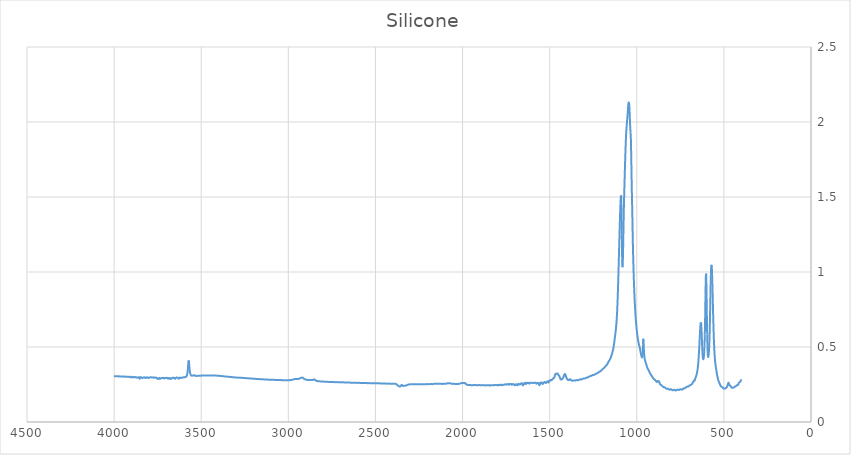
| Category | Silicone |
|---|---|
| 399.264 | 0.284 |
| 401.193 | 0.279 |
| 403.122 | 0.275 |
| 405.05 | 0.272 |
| 406.979 | 0.268 |
| 408.908 | 0.266 |
| 410.837 | 0.265 |
| 412.766 | 0.262 |
| 414.694 | 0.26 |
| 416.623 | 0.254 |
| 418.552 | 0.247 |
| 420.481 | 0.247 |
| 422.41 | 0.248 |
| 424.339 | 0.245 |
| 426.267 | 0.244 |
| 428.196 | 0.243 |
| 430.125 | 0.241 |
| 432.054 | 0.238 |
| 433.983 | 0.236 |
| 435.911 | 0.236 |
| 437.84 | 0.235 |
| 439.769 | 0.234 |
| 441.698 | 0.232 |
| 443.627 | 0.229 |
| 445.555 | 0.229 |
| 447.484 | 0.228 |
| 449.413 | 0.228 |
| 451.342 | 0.228 |
| 453.271 | 0.228 |
| 455.2 | 0.229 |
| 457.128 | 0.231 |
| 459.057 | 0.235 |
| 460.986 | 0.239 |
| 462.915 | 0.241 |
| 464.844 | 0.243 |
| 466.772 | 0.245 |
| 468.701 | 0.249 |
| 470.63 | 0.255 |
| 472.559 | 0.261 |
| 474.488 | 0.261 |
| 476.416 | 0.255 |
| 478.345 | 0.248 |
| 480.274 | 0.24 |
| 482.203 | 0.234 |
| 484.132 | 0.231 |
| 486.06 | 0.229 |
| 487.989 | 0.227 |
| 489.918 | 0.226 |
| 491.847 | 0.224 |
| 493.776 | 0.223 |
| 495.705 | 0.224 |
| 497.633 | 0.223 |
| 499.562 | 0.222 |
| 501.491 | 0.223 |
| 503.42 | 0.225 |
| 505.349 | 0.228 |
| 507.277 | 0.23 |
| 509.206 | 0.232 |
| 511.135 | 0.234 |
| 513.064 | 0.235 |
| 514.993 | 0.236 |
| 516.921 | 0.238 |
| 518.85 | 0.241 |
| 520.779 | 0.246 |
| 522.708 | 0.252 |
| 524.637 | 0.257 |
| 526.566 | 0.261 |
| 528.494 | 0.267 |
| 530.423 | 0.273 |
| 532.352 | 0.28 |
| 534.281 | 0.288 |
| 536.21 | 0.298 |
| 538.138 | 0.309 |
| 540.067 | 0.322 |
| 541.996 | 0.336 |
| 543.925 | 0.35 |
| 545.854 | 0.363 |
| 547.782 | 0.378 |
| 549.711 | 0.397 |
| 551.64 | 0.423 |
| 553.569 | 0.455 |
| 555.498 | 0.495 |
| 557.427 | 0.548 |
| 559.355 | 0.616 |
| 561.284 | 0.696 |
| 563.213 | 0.786 |
| 565.142 | 0.879 |
| 567.071 | 0.963 |
| 568.999 | 1.023 |
| 570.928 | 1.048 |
| 572.857 | 1.035 |
| 574.786 | 0.979 |
| 576.715 | 0.881 |
| 578.643 | 0.761 |
| 580.572 | 0.649 |
| 582.501 | 0.56 |
| 584.43 | 0.5 |
| 586.359 | 0.464 |
| 588.287 | 0.442 |
| 590.216 | 0.433 |
| 592.145 | 0.447 |
| 594.074 | 0.494 |
| 596.003 | 0.584 |
| 597.932 | 0.727 |
| 599.86 | 0.887 |
| 601.789 | 0.989 |
| 603.718 | 0.972 |
| 605.647 | 0.85 |
| 607.576 | 0.7 |
| 609.504 | 0.582 |
| 611.433 | 0.506 |
| 613.362 | 0.46 |
| 615.291 | 0.434 |
| 617.22 | 0.421 |
| 619.148 | 0.419 |
| 621.077 | 0.433 |
| 623.006 | 0.463 |
| 624.935 | 0.51 |
| 626.864 | 0.568 |
| 628.793 | 0.624 |
| 630.721 | 0.658 |
| 632.65 | 0.665 |
| 634.579 | 0.647 |
| 636.508 | 0.611 |
| 638.437 | 0.567 |
| 640.365 | 0.521 |
| 642.294 | 0.478 |
| 644.223 | 0.44 |
| 646.152 | 0.407 |
| 648.081 | 0.381 |
| 650.009 | 0.36 |
| 651.938 | 0.344 |
| 653.867 | 0.331 |
| 655.796 | 0.32 |
| 657.725 | 0.312 |
| 659.654 | 0.305 |
| 661.582 | 0.298 |
| 663.511 | 0.293 |
| 665.44 | 0.286 |
| 667.369 | 0.277 |
| 669.298 | 0.274 |
| 671.226 | 0.276 |
| 673.155 | 0.274 |
| 675.084 | 0.27 |
| 677.013 | 0.266 |
| 678.942 | 0.262 |
| 680.87 | 0.258 |
| 682.799 | 0.254 |
| 684.728 | 0.251 |
| 686.657 | 0.249 |
| 688.586 | 0.248 |
| 690.515 | 0.247 |
| 692.443 | 0.246 |
| 694.372 | 0.245 |
| 696.301 | 0.244 |
| 698.23 | 0.242 |
| 700.159 | 0.24 |
| 702.087 | 0.238 |
| 704.016 | 0.237 |
| 705.945 | 0.236 |
| 707.874 | 0.236 |
| 709.803 | 0.236 |
| 711.731 | 0.236 |
| 713.66 | 0.235 |
| 715.589 | 0.234 |
| 717.518 | 0.231 |
| 719.447 | 0.229 |
| 721.375 | 0.227 |
| 723.304 | 0.225 |
| 725.233 | 0.224 |
| 727.162 | 0.224 |
| 729.091 | 0.224 |
| 731.02 | 0.224 |
| 732.948 | 0.223 |
| 734.877 | 0.221 |
| 736.806 | 0.218 |
| 738.735 | 0.216 |
| 740.664 | 0.216 |
| 742.592 | 0.216 |
| 744.521 | 0.217 |
| 746.45 | 0.218 |
| 748.379 | 0.218 |
| 750.308 | 0.218 |
| 752.236 | 0.217 |
| 754.165 | 0.215 |
| 756.094 | 0.214 |
| 758.023 | 0.213 |
| 759.952 | 0.213 |
| 761.881 | 0.214 |
| 763.809 | 0.215 |
| 765.738 | 0.216 |
| 767.667 | 0.216 |
| 769.596 | 0.215 |
| 771.525 | 0.213 |
| 773.453 | 0.211 |
| 775.382 | 0.21 |
| 777.311 | 0.21 |
| 779.24 | 0.211 |
| 781.169 | 0.213 |
| 783.097 | 0.214 |
| 785.026 | 0.215 |
| 786.955 | 0.215 |
| 788.884 | 0.214 |
| 790.813 | 0.212 |
| 792.742 | 0.212 |
| 794.67 | 0.212 |
| 796.599 | 0.213 |
| 798.528 | 0.215 |
| 800.457 | 0.217 |
| 802.386 | 0.218 |
| 804.314 | 0.218 |
| 806.243 | 0.218 |
| 808.172 | 0.216 |
| 810.101 | 0.215 |
| 812.03 | 0.215 |
| 813.958 | 0.216 |
| 815.887 | 0.217 |
| 817.816 | 0.219 |
| 819.745 | 0.221 |
| 821.674 | 0.222 |
| 823.602 | 0.222 |
| 825.531 | 0.222 |
| 827.46 | 0.221 |
| 829.389 | 0.222 |
| 831.318 | 0.222 |
| 833.247 | 0.224 |
| 835.175 | 0.226 |
| 837.104 | 0.229 |
| 839.033 | 0.23 |
| 840.962 | 0.231 |
| 842.891 | 0.232 |
| 844.819 | 0.232 |
| 846.748 | 0.233 |
| 848.677 | 0.234 |
| 850.606 | 0.236 |
| 852.535 | 0.238 |
| 854.463 | 0.241 |
| 856.392 | 0.243 |
| 858.321 | 0.245 |
| 860.25 | 0.246 |
| 862.179 | 0.248 |
| 864.108 | 0.25 |
| 866.036 | 0.252 |
| 867.965 | 0.256 |
| 869.894 | 0.262 |
| 871.823 | 0.269 |
| 873.752 | 0.272 |
| 875.68 | 0.271 |
| 877.609 | 0.271 |
| 879.538 | 0.274 |
| 881.467 | 0.272 |
| 883.396 | 0.268 |
| 885.324 | 0.267 |
| 887.253 | 0.269 |
| 889.182 | 0.272 |
| 891.111 | 0.275 |
| 893.04 | 0.278 |
| 894.969 | 0.28 |
| 896.897 | 0.282 |
| 898.826 | 0.284 |
| 900.755 | 0.285 |
| 902.684 | 0.287 |
| 904.613 | 0.29 |
| 906.541 | 0.293 |
| 908.47 | 0.297 |
| 910.399 | 0.301 |
| 912.328 | 0.304 |
| 914.257 | 0.308 |
| 916.185 | 0.311 |
| 918.114 | 0.314 |
| 920.043 | 0.317 |
| 921.972 | 0.321 |
| 923.901 | 0.325 |
| 925.83 | 0.33 |
| 927.758 | 0.334 |
| 929.687 | 0.339 |
| 931.616 | 0.344 |
| 933.545 | 0.348 |
| 935.474 | 0.352 |
| 937.402 | 0.356 |
| 939.331 | 0.361 |
| 941.26 | 0.368 |
| 943.189 | 0.375 |
| 945.118 | 0.383 |
| 947.046 | 0.39 |
| 948.975 | 0.396 |
| 950.904 | 0.404 |
| 952.833 | 0.412 |
| 954.762 | 0.422 |
| 956.69 | 0.44 |
| 958.619 | 0.468 |
| 960.548 | 0.518 |
| 962.477 | 0.555 |
| 964.406 | 0.516 |
| 966.335 | 0.453 |
| 968.263 | 0.429 |
| 970.192 | 0.429 |
| 972.121 | 0.436 |
| 974.05 | 0.444 |
| 975.979 | 0.453 |
| 977.907 | 0.464 |
| 979.836 | 0.476 |
| 981.765 | 0.489 |
| 983.694 | 0.499 |
| 985.623 | 0.508 |
| 987.551 | 0.516 |
| 989.48 | 0.526 |
| 991.409 | 0.537 |
| 993.338 | 0.551 |
| 995.267 | 0.565 |
| 997.196 | 0.582 |
| 999.124 | 0.602 |
| 1001.05 | 0.623 |
| 1002.98 | 0.647 |
| 1004.91 | 0.674 |
| 1006.84 | 0.704 |
| 1008.77 | 0.739 |
| 1010.7 | 0.78 |
| 1012.63 | 0.825 |
| 1014.55 | 0.877 |
| 1016.48 | 0.938 |
| 1018.41 | 1.007 |
| 1020.34 | 1.084 |
| 1022.27 | 1.178 |
| 1024.2 | 1.296 |
| 1026.13 | 1.417 |
| 1028.06 | 1.525 |
| 1029.99 | 1.643 |
| 1031.91 | 1.78 |
| 1033.84 | 1.886 |
| 1035.77 | 1.932 |
| 1037.7 | 1.965 |
| 1039.63 | 2.021 |
| 1041.56 | 2.08 |
| 1043.49 | 2.115 |
| 1045.42 | 2.13 |
| 1047.34 | 2.126 |
| 1049.27 | 2.105 |
| 1051.2 | 2.075 |
| 1053.13 | 2.045 |
| 1055.06 | 2.018 |
| 1056.99 | 1.989 |
| 1058.92 | 1.959 |
| 1060.85 | 1.925 |
| 1062.78 | 1.877 |
| 1064.7 | 1.815 |
| 1066.63 | 1.746 |
| 1068.56 | 1.67 |
| 1070.49 | 1.591 |
| 1072.42 | 1.507 |
| 1074.35 | 1.412 |
| 1076.28 | 1.295 |
| 1078.21 | 1.169 |
| 1080.13 | 1.069 |
| 1082.06 | 1.032 |
| 1083.99 | 1.091 |
| 1085.92 | 1.248 |
| 1087.85 | 1.427 |
| 1089.78 | 1.511 |
| 1091.71 | 1.505 |
| 1093.64 | 1.459 |
| 1095.56 | 1.395 |
| 1097.49 | 1.32 |
| 1099.42 | 1.239 |
| 1101.35 | 1.155 |
| 1103.28 | 1.072 |
| 1105.21 | 0.99 |
| 1107.14 | 0.913 |
| 1109.07 | 0.843 |
| 1111.0 | 0.782 |
| 1112.92 | 0.732 |
| 1114.85 | 0.691 |
| 1116.78 | 0.658 |
| 1118.71 | 0.633 |
| 1120.64 | 0.612 |
| 1122.57 | 0.593 |
| 1124.5 | 0.575 |
| 1126.43 | 0.557 |
| 1128.35 | 0.539 |
| 1130.28 | 0.522 |
| 1132.21 | 0.507 |
| 1134.14 | 0.494 |
| 1136.07 | 0.483 |
| 1138.0 | 0.473 |
| 1139.93 | 0.465 |
| 1141.86 | 0.457 |
| 1143.79 | 0.449 |
| 1145.71 | 0.442 |
| 1147.64 | 0.435 |
| 1149.57 | 0.429 |
| 1151.5 | 0.423 |
| 1153.43 | 0.419 |
| 1155.36 | 0.415 |
| 1157.29 | 0.411 |
| 1159.22 | 0.407 |
| 1161.14 | 0.404 |
| 1163.07 | 0.4 |
| 1165.0 | 0.395 |
| 1166.93 | 0.391 |
| 1168.86 | 0.387 |
| 1170.79 | 0.383 |
| 1172.72 | 0.38 |
| 1174.65 | 0.378 |
| 1176.57 | 0.376 |
| 1178.5 | 0.373 |
| 1180.43 | 0.371 |
| 1182.36 | 0.368 |
| 1184.29 | 0.365 |
| 1186.22 | 0.362 |
| 1188.15 | 0.36 |
| 1190.08 | 0.357 |
| 1192.01 | 0.356 |
| 1193.93 | 0.355 |
| 1195.86 | 0.353 |
| 1197.79 | 0.351 |
| 1199.72 | 0.349 |
| 1201.65 | 0.346 |
| 1203.58 | 0.343 |
| 1205.51 | 0.341 |
| 1207.44 | 0.339 |
| 1209.36 | 0.338 |
| 1211.29 | 0.337 |
| 1213.22 | 0.336 |
| 1215.15 | 0.335 |
| 1217.08 | 0.333 |
| 1219.01 | 0.331 |
| 1220.94 | 0.329 |
| 1222.87 | 0.327 |
| 1224.8 | 0.326 |
| 1226.72 | 0.325 |
| 1228.65 | 0.324 |
| 1230.58 | 0.324 |
| 1232.51 | 0.323 |
| 1234.44 | 0.322 |
| 1236.37 | 0.321 |
| 1238.3 | 0.319 |
| 1240.23 | 0.317 |
| 1242.15 | 0.316 |
| 1244.08 | 0.315 |
| 1246.01 | 0.314 |
| 1247.94 | 0.314 |
| 1249.87 | 0.314 |
| 1251.8 | 0.314 |
| 1253.73 | 0.313 |
| 1255.66 | 0.311 |
| 1257.59 | 0.31 |
| 1259.51 | 0.309 |
| 1261.44 | 0.308 |
| 1263.37 | 0.307 |
| 1265.3 | 0.306 |
| 1267.23 | 0.306 |
| 1269.16 | 0.305 |
| 1271.09 | 0.305 |
| 1273.02 | 0.303 |
| 1274.94 | 0.302 |
| 1276.87 | 0.3 |
| 1278.8 | 0.299 |
| 1280.73 | 0.298 |
| 1282.66 | 0.297 |
| 1284.59 | 0.297 |
| 1286.52 | 0.297 |
| 1288.45 | 0.296 |
| 1290.37 | 0.295 |
| 1292.3 | 0.294 |
| 1294.23 | 0.292 |
| 1296.16 | 0.291 |
| 1298.09 | 0.29 |
| 1300.02 | 0.29 |
| 1301.95 | 0.29 |
| 1303.88 | 0.29 |
| 1305.81 | 0.29 |
| 1307.73 | 0.289 |
| 1309.66 | 0.288 |
| 1311.59 | 0.287 |
| 1313.52 | 0.285 |
| 1315.45 | 0.285 |
| 1317.38 | 0.284 |
| 1319.31 | 0.284 |
| 1321.24 | 0.284 |
| 1323.16 | 0.285 |
| 1325.09 | 0.285 |
| 1327.02 | 0.284 |
| 1328.95 | 0.283 |
| 1330.88 | 0.281 |
| 1332.81 | 0.28 |
| 1334.74 | 0.279 |
| 1336.67 | 0.279 |
| 1338.6 | 0.278 |
| 1340.52 | 0.279 |
| 1342.45 | 0.28 |
| 1344.38 | 0.28 |
| 1346.31 | 0.279 |
| 1348.24 | 0.278 |
| 1350.17 | 0.277 |
| 1352.1 | 0.277 |
| 1354.03 | 0.276 |
| 1355.95 | 0.276 |
| 1357.88 | 0.277 |
| 1359.81 | 0.277 |
| 1361.74 | 0.276 |
| 1363.67 | 0.276 |
| 1365.6 | 0.277 |
| 1367.53 | 0.276 |
| 1369.46 | 0.276 |
| 1371.38 | 0.276 |
| 1373.31 | 0.276 |
| 1375.24 | 0.277 |
| 1377.17 | 0.279 |
| 1379.1 | 0.281 |
| 1381.03 | 0.283 |
| 1382.96 | 0.286 |
| 1384.89 | 0.285 |
| 1386.82 | 0.281 |
| 1388.74 | 0.279 |
| 1390.67 | 0.28 |
| 1392.6 | 0.279 |
| 1394.53 | 0.279 |
| 1396.46 | 0.282 |
| 1398.39 | 0.284 |
| 1400.32 | 0.288 |
| 1402.25 | 0.292 |
| 1404.17 | 0.296 |
| 1406.1 | 0.302 |
| 1408.03 | 0.31 |
| 1409.96 | 0.316 |
| 1411.89 | 0.319 |
| 1413.82 | 0.319 |
| 1415.75 | 0.316 |
| 1417.68 | 0.31 |
| 1419.61 | 0.303 |
| 1421.53 | 0.3 |
| 1423.46 | 0.296 |
| 1425.39 | 0.291 |
| 1427.32 | 0.288 |
| 1429.25 | 0.285 |
| 1431.18 | 0.285 |
| 1433.11 | 0.285 |
| 1435.04 | 0.284 |
| 1436.96 | 0.283 |
| 1438.89 | 0.288 |
| 1440.82 | 0.294 |
| 1442.75 | 0.3 |
| 1444.68 | 0.306 |
| 1446.61 | 0.31 |
| 1448.54 | 0.311 |
| 1450.47 | 0.314 |
| 1452.4 | 0.319 |
| 1454.32 | 0.324 |
| 1456.25 | 0.323 |
| 1458.18 | 0.322 |
| 1460.11 | 0.322 |
| 1462.04 | 0.322 |
| 1463.97 | 0.321 |
| 1465.9 | 0.321 |
| 1467.83 | 0.318 |
| 1469.75 | 0.311 |
| 1471.68 | 0.302 |
| 1473.61 | 0.297 |
| 1475.54 | 0.295 |
| 1477.47 | 0.293 |
| 1479.4 | 0.291 |
| 1481.33 | 0.288 |
| 1483.26 | 0.286 |
| 1485.18 | 0.284 |
| 1487.11 | 0.281 |
| 1489.04 | 0.279 |
| 1490.97 | 0.279 |
| 1492.9 | 0.281 |
| 1494.83 | 0.279 |
| 1496.76 | 0.275 |
| 1498.69 | 0.275 |
| 1500.62 | 0.276 |
| 1502.54 | 0.276 |
| 1504.47 | 0.27 |
| 1506.4 | 0.264 |
| 1508.33 | 0.266 |
| 1510.26 | 0.27 |
| 1512.19 | 0.271 |
| 1514.12 | 0.27 |
| 1516.05 | 0.267 |
| 1517.97 | 0.265 |
| 1519.9 | 0.262 |
| 1521.83 | 0.26 |
| 1523.76 | 0.263 |
| 1525.69 | 0.264 |
| 1527.62 | 0.265 |
| 1529.55 | 0.267 |
| 1531.48 | 0.265 |
| 1533.41 | 0.262 |
| 1535.33 | 0.263 |
| 1537.26 | 0.261 |
| 1539.19 | 0.254 |
| 1541.12 | 0.253 |
| 1543.05 | 0.258 |
| 1544.98 | 0.261 |
| 1546.91 | 0.264 |
| 1548.84 | 0.264 |
| 1550.76 | 0.262 |
| 1552.69 | 0.26 |
| 1554.62 | 0.257 |
| 1556.55 | 0.252 |
| 1558.48 | 0.245 |
| 1560.41 | 0.249 |
| 1562.34 | 0.258 |
| 1564.27 | 0.26 |
| 1566.19 | 0.261 |
| 1568.12 | 0.259 |
| 1570.05 | 0.258 |
| 1571.98 | 0.26 |
| 1573.91 | 0.259 |
| 1575.84 | 0.255 |
| 1577.77 | 0.257 |
| 1579.7 | 0.261 |
| 1581.63 | 0.262 |
| 1583.55 | 0.262 |
| 1585.48 | 0.262 |
| 1587.41 | 0.262 |
| 1589.34 | 0.261 |
| 1591.27 | 0.26 |
| 1593.2 | 0.259 |
| 1595.13 | 0.259 |
| 1597.06 | 0.26 |
| 1598.98 | 0.261 |
| 1600.91 | 0.261 |
| 1602.84 | 0.262 |
| 1604.77 | 0.262 |
| 1606.7 | 0.262 |
| 1608.63 | 0.261 |
| 1610.56 | 0.26 |
| 1612.49 | 0.26 |
| 1614.42 | 0.258 |
| 1616.34 | 0.255 |
| 1618.27 | 0.258 |
| 1620.2 | 0.261 |
| 1622.13 | 0.26 |
| 1624.06 | 0.26 |
| 1625.99 | 0.261 |
| 1627.92 | 0.261 |
| 1629.85 | 0.261 |
| 1631.77 | 0.261 |
| 1633.7 | 0.257 |
| 1635.63 | 0.253 |
| 1637.56 | 0.256 |
| 1639.49 | 0.26 |
| 1641.42 | 0.261 |
| 1643.35 | 0.26 |
| 1645.28 | 0.255 |
| 1647.2 | 0.253 |
| 1649.13 | 0.255 |
| 1651.06 | 0.251 |
| 1652.99 | 0.244 |
| 1654.92 | 0.25 |
| 1656.85 | 0.257 |
| 1658.78 | 0.258 |
| 1660.71 | 0.257 |
| 1662.64 | 0.255 |
| 1664.56 | 0.256 |
| 1666.49 | 0.255 |
| 1668.42 | 0.251 |
| 1670.35 | 0.25 |
| 1672.28 | 0.252 |
| 1674.21 | 0.251 |
| 1676.14 | 0.251 |
| 1678.07 | 0.254 |
| 1679.99 | 0.254 |
| 1681.92 | 0.25 |
| 1683.85 | 0.245 |
| 1685.78 | 0.246 |
| 1687.71 | 0.251 |
| 1689.64 | 0.251 |
| 1691.57 | 0.252 |
| 1693.5 | 0.251 |
| 1695.43 | 0.247 |
| 1697.35 | 0.247 |
| 1699.28 | 0.245 |
| 1701.21 | 0.245 |
| 1703.14 | 0.25 |
| 1705.07 | 0.25 |
| 1707.0 | 0.25 |
| 1708.93 | 0.252 |
| 1710.86 | 0.253 |
| 1712.78 | 0.253 |
| 1714.71 | 0.251 |
| 1716.64 | 0.248 |
| 1718.57 | 0.249 |
| 1720.5 | 0.253 |
| 1722.43 | 0.254 |
| 1724.36 | 0.253 |
| 1726.29 | 0.253 |
| 1728.22 | 0.253 |
| 1730.14 | 0.253 |
| 1732.07 | 0.25 |
| 1734.0 | 0.248 |
| 1735.93 | 0.251 |
| 1737.86 | 0.254 |
| 1739.79 | 0.252 |
| 1741.72 | 0.252 |
| 1743.65 | 0.252 |
| 1745.57 | 0.251 |
| 1747.5 | 0.251 |
| 1749.43 | 0.249 |
| 1751.36 | 0.249 |
| 1753.29 | 0.252 |
| 1755.22 | 0.252 |
| 1757.15 | 0.25 |
| 1759.08 | 0.25 |
| 1761.0 | 0.248 |
| 1762.93 | 0.247 |
| 1764.86 | 0.249 |
| 1766.79 | 0.248 |
| 1768.72 | 0.247 |
| 1770.65 | 0.246 |
| 1772.58 | 0.245 |
| 1774.51 | 0.247 |
| 1776.44 | 0.249 |
| 1778.36 | 0.248 |
| 1780.29 | 0.247 |
| 1782.22 | 0.247 |
| 1784.15 | 0.247 |
| 1786.08 | 0.247 |
| 1788.01 | 0.248 |
| 1789.94 | 0.247 |
| 1791.87 | 0.245 |
| 1793.79 | 0.245 |
| 1795.72 | 0.247 |
| 1797.65 | 0.246 |
| 1799.58 | 0.245 |
| 1801.51 | 0.245 |
| 1803.44 | 0.246 |
| 1805.37 | 0.247 |
| 1807.3 | 0.247 |
| 1809.23 | 0.247 |
| 1811.15 | 0.246 |
| 1813.08 | 0.247 |
| 1815.01 | 0.246 |
| 1816.94 | 0.246 |
| 1818.87 | 0.246 |
| 1820.8 | 0.246 |
| 1822.73 | 0.246 |
| 1824.66 | 0.245 |
| 1826.58 | 0.245 |
| 1828.51 | 0.245 |
| 1830.44 | 0.244 |
| 1832.37 | 0.245 |
| 1834.3 | 0.246 |
| 1836.23 | 0.245 |
| 1838.16 | 0.245 |
| 1840.09 | 0.245 |
| 1842.01 | 0.244 |
| 1843.94 | 0.242 |
| 1845.87 | 0.244 |
| 1847.8 | 0.245 |
| 1849.73 | 0.246 |
| 1851.66 | 0.245 |
| 1853.59 | 0.245 |
| 1855.52 | 0.245 |
| 1857.45 | 0.245 |
| 1859.37 | 0.245 |
| 1861.3 | 0.245 |
| 1863.23 | 0.245 |
| 1865.16 | 0.245 |
| 1867.09 | 0.244 |
| 1869.02 | 0.243 |
| 1870.95 | 0.244 |
| 1872.88 | 0.245 |
| 1874.8 | 0.245 |
| 1876.73 | 0.245 |
| 1878.66 | 0.245 |
| 1880.59 | 0.246 |
| 1882.52 | 0.246 |
| 1884.45 | 0.246 |
| 1886.38 | 0.246 |
| 1888.31 | 0.245 |
| 1890.24 | 0.245 |
| 1892.16 | 0.245 |
| 1894.09 | 0.245 |
| 1896.02 | 0.245 |
| 1897.95 | 0.246 |
| 1899.88 | 0.246 |
| 1901.81 | 0.246 |
| 1903.74 | 0.246 |
| 1905.67 | 0.246 |
| 1907.59 | 0.246 |
| 1909.52 | 0.245 |
| 1911.45 | 0.245 |
| 1913.38 | 0.246 |
| 1915.31 | 0.245 |
| 1917.24 | 0.245 |
| 1919.17 | 0.245 |
| 1921.1 | 0.246 |
| 1923.03 | 0.246 |
| 1924.95 | 0.246 |
| 1926.88 | 0.246 |
| 1928.81 | 0.246 |
| 1930.74 | 0.246 |
| 1932.67 | 0.246 |
| 1934.6 | 0.246 |
| 1936.53 | 0.246 |
| 1938.46 | 0.246 |
| 1940.38 | 0.246 |
| 1942.31 | 0.245 |
| 1944.24 | 0.245 |
| 1946.17 | 0.246 |
| 1948.1 | 0.246 |
| 1950.03 | 0.246 |
| 1951.96 | 0.246 |
| 1953.89 | 0.246 |
| 1955.81 | 0.246 |
| 1957.74 | 0.247 |
| 1959.67 | 0.247 |
| 1961.6 | 0.247 |
| 1963.53 | 0.247 |
| 1965.46 | 0.246 |
| 1967.39 | 0.246 |
| 1969.32 | 0.247 |
| 1971.25 | 0.247 |
| 1973.17 | 0.248 |
| 1975.1 | 0.249 |
| 1977.03 | 0.25 |
| 1978.96 | 0.251 |
| 1980.89 | 0.253 |
| 1982.82 | 0.256 |
| 1984.75 | 0.258 |
| 1986.68 | 0.26 |
| 1988.6 | 0.26 |
| 1990.53 | 0.26 |
| 1992.46 | 0.259 |
| 1994.39 | 0.259 |
| 1996.32 | 0.259 |
| 1998.25 | 0.26 |
| 2000.18 | 0.26 |
| 2002.11 | 0.261 |
| 2004.04 | 0.26 |
| 2005.96 | 0.26 |
| 2007.89 | 0.259 |
| 2009.82 | 0.258 |
| 2011.75 | 0.257 |
| 2013.68 | 0.257 |
| 2015.61 | 0.256 |
| 2017.54 | 0.255 |
| 2019.47 | 0.255 |
| 2021.39 | 0.255 |
| 2023.32 | 0.254 |
| 2025.25 | 0.254 |
| 2027.18 | 0.254 |
| 2029.11 | 0.254 |
| 2031.04 | 0.254 |
| 2032.97 | 0.254 |
| 2034.9 | 0.254 |
| 2036.82 | 0.253 |
| 2038.75 | 0.253 |
| 2040.68 | 0.253 |
| 2042.61 | 0.253 |
| 2044.54 | 0.254 |
| 2046.47 | 0.255 |
| 2048.4 | 0.255 |
| 2050.33 | 0.255 |
| 2052.26 | 0.255 |
| 2054.18 | 0.255 |
| 2056.11 | 0.254 |
| 2058.04 | 0.254 |
| 2059.97 | 0.254 |
| 2061.9 | 0.255 |
| 2063.83 | 0.255 |
| 2065.76 | 0.256 |
| 2067.69 | 0.257 |
| 2069.61 | 0.257 |
| 2071.54 | 0.258 |
| 2073.47 | 0.258 |
| 2075.4 | 0.258 |
| 2077.33 | 0.258 |
| 2079.26 | 0.258 |
| 2081.19 | 0.258 |
| 2083.12 | 0.258 |
| 2085.05 | 0.258 |
| 2086.97 | 0.258 |
| 2088.9 | 0.257 |
| 2090.83 | 0.257 |
| 2092.76 | 0.256 |
| 2094.69 | 0.256 |
| 2096.62 | 0.255 |
| 2098.55 | 0.255 |
| 2100.48 | 0.255 |
| 2102.4 | 0.255 |
| 2104.33 | 0.255 |
| 2106.26 | 0.255 |
| 2108.19 | 0.255 |
| 2110.12 | 0.255 |
| 2112.05 | 0.255 |
| 2113.98 | 0.254 |
| 2115.91 | 0.254 |
| 2117.83 | 0.254 |
| 2119.76 | 0.254 |
| 2121.69 | 0.254 |
| 2123.62 | 0.255 |
| 2125.55 | 0.255 |
| 2127.48 | 0.255 |
| 2129.41 | 0.255 |
| 2131.34 | 0.255 |
| 2133.27 | 0.254 |
| 2135.19 | 0.254 |
| 2137.12 | 0.254 |
| 2139.05 | 0.255 |
| 2140.98 | 0.255 |
| 2142.91 | 0.256 |
| 2144.84 | 0.256 |
| 2146.77 | 0.256 |
| 2148.7 | 0.255 |
| 2150.62 | 0.255 |
| 2152.55 | 0.255 |
| 2154.48 | 0.254 |
| 2156.41 | 0.254 |
| 2158.34 | 0.255 |
| 2160.27 | 0.255 |
| 2162.2 | 0.255 |
| 2164.13 | 0.254 |
| 2166.06 | 0.254 |
| 2167.98 | 0.254 |
| 2169.91 | 0.253 |
| 2171.84 | 0.252 |
| 2173.77 | 0.252 |
| 2175.7 | 0.252 |
| 2177.63 | 0.253 |
| 2179.56 | 0.253 |
| 2181.49 | 0.254 |
| 2183.41 | 0.254 |
| 2185.34 | 0.253 |
| 2187.27 | 0.253 |
| 2189.2 | 0.252 |
| 2191.13 | 0.252 |
| 2193.06 | 0.252 |
| 2194.99 | 0.252 |
| 2196.92 | 0.253 |
| 2198.85 | 0.253 |
| 2200.77 | 0.253 |
| 2202.7 | 0.253 |
| 2204.63 | 0.253 |
| 2206.56 | 0.252 |
| 2208.49 | 0.251 |
| 2210.42 | 0.251 |
| 2212.35 | 0.251 |
| 2214.28 | 0.252 |
| 2216.2 | 0.252 |
| 2218.13 | 0.252 |
| 2220.06 | 0.252 |
| 2221.99 | 0.252 |
| 2223.92 | 0.251 |
| 2225.85 | 0.251 |
| 2227.78 | 0.251 |
| 2229.71 | 0.251 |
| 2231.63 | 0.251 |
| 2233.56 | 0.251 |
| 2235.49 | 0.252 |
| 2237.42 | 0.252 |
| 2239.35 | 0.252 |
| 2241.28 | 0.252 |
| 2243.21 | 0.251 |
| 2245.14 | 0.251 |
| 2247.07 | 0.251 |
| 2248.99 | 0.251 |
| 2250.92 | 0.251 |
| 2252.85 | 0.252 |
| 2254.78 | 0.252 |
| 2256.71 | 0.252 |
| 2258.64 | 0.252 |
| 2260.57 | 0.252 |
| 2262.5 | 0.251 |
| 2264.42 | 0.251 |
| 2266.35 | 0.251 |
| 2268.28 | 0.251 |
| 2270.21 | 0.252 |
| 2272.14 | 0.252 |
| 2274.07 | 0.252 |
| 2276.0 | 0.252 |
| 2277.93 | 0.252 |
| 2279.86 | 0.252 |
| 2281.78 | 0.252 |
| 2283.71 | 0.252 |
| 2285.64 | 0.252 |
| 2287.57 | 0.252 |
| 2289.5 | 0.252 |
| 2291.43 | 0.252 |
| 2293.36 | 0.252 |
| 2295.29 | 0.252 |
| 2297.21 | 0.252 |
| 2299.14 | 0.251 |
| 2301.07 | 0.251 |
| 2303.0 | 0.251 |
| 2304.93 | 0.25 |
| 2306.86 | 0.25 |
| 2308.79 | 0.25 |
| 2310.72 | 0.25 |
| 2312.64 | 0.249 |
| 2314.57 | 0.248 |
| 2316.5 | 0.247 |
| 2318.43 | 0.246 |
| 2320.36 | 0.245 |
| 2322.29 | 0.244 |
| 2324.22 | 0.243 |
| 2326.15 | 0.243 |
| 2328.08 | 0.243 |
| 2330.0 | 0.242 |
| 2331.93 | 0.242 |
| 2333.86 | 0.242 |
| 2335.79 | 0.241 |
| 2337.72 | 0.241 |
| 2339.65 | 0.24 |
| 2341.58 | 0.241 |
| 2343.51 | 0.241 |
| 2345.43 | 0.243 |
| 2347.36 | 0.246 |
| 2349.29 | 0.248 |
| 2351.22 | 0.245 |
| 2353.15 | 0.242 |
| 2355.08 | 0.239 |
| 2357.01 | 0.238 |
| 2358.94 | 0.237 |
| 2360.87 | 0.237 |
| 2362.79 | 0.237 |
| 2364.72 | 0.238 |
| 2366.65 | 0.239 |
| 2368.58 | 0.241 |
| 2370.51 | 0.243 |
| 2372.44 | 0.244 |
| 2374.37 | 0.246 |
| 2376.3 | 0.248 |
| 2378.22 | 0.25 |
| 2380.15 | 0.252 |
| 2382.08 | 0.253 |
| 2384.01 | 0.254 |
| 2385.94 | 0.255 |
| 2387.87 | 0.255 |
| 2389.8 | 0.255 |
| 2391.73 | 0.255 |
| 2393.66 | 0.255 |
| 2395.58 | 0.255 |
| 2397.51 | 0.255 |
| 2399.44 | 0.255 |
| 2401.37 | 0.255 |
| 2403.3 | 0.255 |
| 2405.23 | 0.256 |
| 2407.16 | 0.256 |
| 2409.09 | 0.255 |
| 2411.01 | 0.255 |
| 2412.94 | 0.255 |
| 2414.87 | 0.255 |
| 2416.8 | 0.255 |
| 2418.73 | 0.255 |
| 2420.66 | 0.256 |
| 2422.59 | 0.256 |
| 2424.52 | 0.256 |
| 2426.44 | 0.256 |
| 2428.37 | 0.256 |
| 2430.3 | 0.256 |
| 2432.23 | 0.256 |
| 2434.16 | 0.256 |
| 2436.09 | 0.256 |
| 2438.02 | 0.256 |
| 2439.95 | 0.256 |
| 2441.88 | 0.256 |
| 2443.8 | 0.256 |
| 2445.73 | 0.256 |
| 2447.66 | 0.256 |
| 2449.59 | 0.256 |
| 2451.52 | 0.256 |
| 2453.45 | 0.256 |
| 2455.38 | 0.256 |
| 2457.31 | 0.257 |
| 2459.23 | 0.257 |
| 2461.16 | 0.257 |
| 2463.09 | 0.257 |
| 2465.02 | 0.257 |
| 2466.95 | 0.257 |
| 2468.88 | 0.257 |
| 2470.81 | 0.257 |
| 2472.74 | 0.257 |
| 2474.67 | 0.257 |
| 2476.59 | 0.258 |
| 2478.52 | 0.258 |
| 2480.45 | 0.258 |
| 2482.38 | 0.258 |
| 2484.31 | 0.258 |
| 2486.24 | 0.258 |
| 2488.17 | 0.257 |
| 2490.1 | 0.258 |
| 2492.02 | 0.258 |
| 2493.95 | 0.258 |
| 2495.88 | 0.258 |
| 2497.81 | 0.258 |
| 2499.74 | 0.258 |
| 2501.67 | 0.258 |
| 2503.6 | 0.258 |
| 2505.53 | 0.258 |
| 2507.45 | 0.258 |
| 2509.38 | 0.258 |
| 2511.31 | 0.259 |
| 2513.24 | 0.259 |
| 2515.17 | 0.259 |
| 2517.1 | 0.259 |
| 2519.03 | 0.259 |
| 2520.96 | 0.259 |
| 2522.89 | 0.259 |
| 2524.81 | 0.259 |
| 2526.74 | 0.259 |
| 2528.67 | 0.259 |
| 2530.6 | 0.259 |
| 2532.53 | 0.259 |
| 2534.46 | 0.259 |
| 2536.39 | 0.259 |
| 2538.32 | 0.259 |
| 2540.24 | 0.259 |
| 2542.17 | 0.259 |
| 2544.1 | 0.259 |
| 2546.03 | 0.259 |
| 2547.96 | 0.259 |
| 2549.89 | 0.259 |
| 2551.82 | 0.26 |
| 2553.75 | 0.26 |
| 2555.68 | 0.26 |
| 2557.6 | 0.26 |
| 2559.53 | 0.26 |
| 2561.46 | 0.26 |
| 2563.39 | 0.26 |
| 2565.32 | 0.26 |
| 2567.25 | 0.26 |
| 2569.18 | 0.26 |
| 2571.11 | 0.26 |
| 2573.03 | 0.26 |
| 2574.96 | 0.26 |
| 2576.89 | 0.26 |
| 2578.82 | 0.26 |
| 2580.75 | 0.26 |
| 2582.68 | 0.26 |
| 2584.61 | 0.26 |
| 2586.54 | 0.26 |
| 2588.46 | 0.261 |
| 2590.39 | 0.261 |
| 2592.32 | 0.261 |
| 2594.25 | 0.261 |
| 2596.18 | 0.261 |
| 2598.11 | 0.261 |
| 2600.04 | 0.261 |
| 2601.97 | 0.261 |
| 2603.9 | 0.261 |
| 2605.82 | 0.261 |
| 2607.75 | 0.261 |
| 2609.68 | 0.261 |
| 2611.61 | 0.262 |
| 2613.54 | 0.262 |
| 2615.47 | 0.262 |
| 2617.4 | 0.262 |
| 2619.33 | 0.261 |
| 2621.25 | 0.261 |
| 2623.18 | 0.261 |
| 2625.11 | 0.261 |
| 2627.04 | 0.262 |
| 2628.97 | 0.262 |
| 2630.9 | 0.262 |
| 2632.83 | 0.262 |
| 2634.76 | 0.262 |
| 2636.69 | 0.262 |
| 2638.61 | 0.262 |
| 2640.54 | 0.262 |
| 2642.47 | 0.262 |
| 2644.4 | 0.262 |
| 2646.33 | 0.263 |
| 2648.26 | 0.263 |
| 2650.19 | 0.263 |
| 2652.12 | 0.263 |
| 2654.04 | 0.263 |
| 2655.97 | 0.263 |
| 2657.9 | 0.263 |
| 2659.83 | 0.263 |
| 2661.76 | 0.263 |
| 2663.69 | 0.263 |
| 2665.62 | 0.264 |
| 2667.55 | 0.264 |
| 2669.48 | 0.264 |
| 2671.4 | 0.264 |
| 2673.33 | 0.263 |
| 2675.26 | 0.263 |
| 2677.19 | 0.263 |
| 2679.12 | 0.264 |
| 2681.05 | 0.264 |
| 2682.98 | 0.264 |
| 2684.91 | 0.264 |
| 2686.83 | 0.265 |
| 2688.76 | 0.265 |
| 2690.69 | 0.265 |
| 2692.62 | 0.264 |
| 2694.55 | 0.264 |
| 2696.48 | 0.264 |
| 2698.41 | 0.264 |
| 2700.34 | 0.265 |
| 2702.26 | 0.265 |
| 2704.19 | 0.265 |
| 2706.12 | 0.265 |
| 2708.05 | 0.265 |
| 2709.98 | 0.265 |
| 2711.91 | 0.265 |
| 2713.84 | 0.265 |
| 2715.77 | 0.265 |
| 2717.7 | 0.265 |
| 2719.62 | 0.266 |
| 2721.55 | 0.266 |
| 2723.48 | 0.266 |
| 2725.41 | 0.266 |
| 2727.34 | 0.266 |
| 2729.27 | 0.266 |
| 2731.2 | 0.266 |
| 2733.13 | 0.265 |
| 2735.05 | 0.266 |
| 2736.98 | 0.266 |
| 2738.91 | 0.266 |
| 2740.84 | 0.267 |
| 2742.77 | 0.267 |
| 2744.7 | 0.267 |
| 2746.63 | 0.266 |
| 2748.56 | 0.266 |
| 2750.49 | 0.266 |
| 2752.41 | 0.266 |
| 2754.34 | 0.267 |
| 2756.27 | 0.267 |
| 2758.2 | 0.267 |
| 2760.13 | 0.268 |
| 2762.06 | 0.268 |
| 2763.99 | 0.267 |
| 2765.92 | 0.267 |
| 2767.84 | 0.267 |
| 2769.77 | 0.267 |
| 2771.7 | 0.267 |
| 2773.63 | 0.268 |
| 2775.56 | 0.268 |
| 2777.49 | 0.268 |
| 2779.42 | 0.268 |
| 2781.35 | 0.268 |
| 2783.27 | 0.268 |
| 2785.2 | 0.268 |
| 2787.13 | 0.268 |
| 2789.06 | 0.268 |
| 2790.99 | 0.268 |
| 2792.92 | 0.269 |
| 2794.85 | 0.269 |
| 2796.78 | 0.269 |
| 2798.71 | 0.269 |
| 2800.63 | 0.27 |
| 2802.56 | 0.27 |
| 2804.49 | 0.27 |
| 2806.42 | 0.27 |
| 2808.35 | 0.27 |
| 2810.28 | 0.27 |
| 2812.21 | 0.27 |
| 2814.14 | 0.27 |
| 2816.06 | 0.271 |
| 2817.99 | 0.271 |
| 2819.92 | 0.271 |
| 2821.85 | 0.271 |
| 2823.78 | 0.271 |
| 2825.71 | 0.271 |
| 2827.64 | 0.272 |
| 2829.57 | 0.272 |
| 2831.5 | 0.272 |
| 2833.42 | 0.273 |
| 2835.35 | 0.273 |
| 2837.28 | 0.274 |
| 2839.21 | 0.274 |
| 2841.14 | 0.275 |
| 2843.07 | 0.277 |
| 2845.0 | 0.278 |
| 2846.93 | 0.281 |
| 2848.85 | 0.283 |
| 2850.78 | 0.284 |
| 2852.71 | 0.284 |
| 2854.64 | 0.283 |
| 2856.57 | 0.282 |
| 2858.5 | 0.281 |
| 2860.43 | 0.28 |
| 2862.36 | 0.28 |
| 2864.29 | 0.28 |
| 2866.21 | 0.279 |
| 2868.14 | 0.279 |
| 2870.07 | 0.279 |
| 2872.0 | 0.28 |
| 2873.93 | 0.28 |
| 2875.86 | 0.28 |
| 2877.79 | 0.28 |
| 2879.72 | 0.279 |
| 2881.64 | 0.279 |
| 2883.57 | 0.279 |
| 2885.5 | 0.279 |
| 2887.43 | 0.28 |
| 2889.36 | 0.28 |
| 2891.29 | 0.281 |
| 2893.22 | 0.281 |
| 2895.15 | 0.282 |
| 2897.07 | 0.282 |
| 2899.0 | 0.283 |
| 2900.93 | 0.283 |
| 2902.86 | 0.284 |
| 2904.79 | 0.284 |
| 2906.72 | 0.285 |
| 2908.65 | 0.287 |
| 2910.58 | 0.288 |
| 2912.51 | 0.291 |
| 2914.43 | 0.293 |
| 2916.36 | 0.295 |
| 2918.29 | 0.296 |
| 2920.22 | 0.296 |
| 2922.15 | 0.296 |
| 2924.08 | 0.295 |
| 2926.01 | 0.295 |
| 2927.94 | 0.294 |
| 2929.86 | 0.293 |
| 2931.79 | 0.292 |
| 2933.72 | 0.291 |
| 2935.65 | 0.29 |
| 2937.58 | 0.289 |
| 2939.51 | 0.288 |
| 2941.44 | 0.287 |
| 2943.37 | 0.287 |
| 2945.3 | 0.287 |
| 2947.22 | 0.287 |
| 2949.15 | 0.287 |
| 2951.08 | 0.287 |
| 2953.01 | 0.287 |
| 2954.94 | 0.287 |
| 2956.87 | 0.287 |
| 2958.8 | 0.287 |
| 2960.73 | 0.287 |
| 2962.65 | 0.287 |
| 2964.58 | 0.286 |
| 2966.51 | 0.286 |
| 2968.44 | 0.285 |
| 2970.37 | 0.284 |
| 2972.3 | 0.283 |
| 2974.23 | 0.282 |
| 2976.16 | 0.282 |
| 2978.08 | 0.281 |
| 2980.01 | 0.281 |
| 2981.94 | 0.281 |
| 2983.87 | 0.281 |
| 2985.8 | 0.28 |
| 2987.73 | 0.28 |
| 2989.66 | 0.28 |
| 2991.59 | 0.279 |
| 2993.52 | 0.279 |
| 2995.44 | 0.279 |
| 2997.37 | 0.279 |
| 2999.3 | 0.279 |
| 3001.23 | 0.279 |
| 3003.16 | 0.279 |
| 3005.09 | 0.279 |
| 3007.02 | 0.279 |
| 3008.95 | 0.279 |
| 3010.87 | 0.278 |
| 3012.8 | 0.278 |
| 3014.73 | 0.278 |
| 3016.66 | 0.278 |
| 3018.59 | 0.279 |
| 3020.52 | 0.279 |
| 3022.45 | 0.279 |
| 3024.38 | 0.279 |
| 3026.31 | 0.279 |
| 3028.23 | 0.279 |
| 3030.16 | 0.279 |
| 3032.09 | 0.278 |
| 3034.02 | 0.279 |
| 3035.95 | 0.279 |
| 3037.88 | 0.279 |
| 3039.81 | 0.279 |
| 3041.74 | 0.279 |
| 3043.66 | 0.279 |
| 3045.59 | 0.279 |
| 3047.52 | 0.279 |
| 3049.45 | 0.279 |
| 3051.38 | 0.279 |
| 3053.31 | 0.279 |
| 3055.24 | 0.28 |
| 3057.17 | 0.28 |
| 3059.09 | 0.28 |
| 3061.02 | 0.28 |
| 3062.95 | 0.28 |
| 3064.88 | 0.28 |
| 3066.81 | 0.28 |
| 3068.74 | 0.28 |
| 3070.67 | 0.28 |
| 3072.6 | 0.28 |
| 3074.53 | 0.281 |
| 3076.45 | 0.281 |
| 3078.38 | 0.281 |
| 3080.31 | 0.281 |
| 3082.24 | 0.281 |
| 3084.17 | 0.281 |
| 3086.1 | 0.281 |
| 3088.03 | 0.281 |
| 3089.96 | 0.281 |
| 3091.88 | 0.281 |
| 3093.81 | 0.282 |
| 3095.74 | 0.282 |
| 3097.67 | 0.282 |
| 3099.6 | 0.282 |
| 3101.53 | 0.282 |
| 3103.46 | 0.282 |
| 3105.39 | 0.282 |
| 3107.32 | 0.282 |
| 3109.24 | 0.282 |
| 3111.17 | 0.282 |
| 3113.1 | 0.282 |
| 3115.03 | 0.282 |
| 3116.96 | 0.282 |
| 3118.89 | 0.283 |
| 3120.82 | 0.283 |
| 3122.75 | 0.283 |
| 3124.67 | 0.283 |
| 3126.6 | 0.283 |
| 3128.53 | 0.283 |
| 3130.46 | 0.283 |
| 3132.39 | 0.284 |
| 3134.32 | 0.284 |
| 3136.25 | 0.284 |
| 3138.18 | 0.284 |
| 3140.11 | 0.284 |
| 3142.03 | 0.284 |
| 3143.96 | 0.284 |
| 3145.89 | 0.284 |
| 3147.82 | 0.284 |
| 3149.75 | 0.285 |
| 3151.68 | 0.285 |
| 3153.61 | 0.285 |
| 3155.54 | 0.285 |
| 3157.46 | 0.285 |
| 3159.39 | 0.285 |
| 3161.32 | 0.286 |
| 3163.25 | 0.286 |
| 3165.18 | 0.286 |
| 3167.11 | 0.286 |
| 3169.04 | 0.286 |
| 3170.97 | 0.287 |
| 3172.89 | 0.287 |
| 3174.82 | 0.287 |
| 3176.75 | 0.287 |
| 3178.68 | 0.287 |
| 3180.61 | 0.287 |
| 3182.54 | 0.287 |
| 3184.47 | 0.287 |
| 3186.4 | 0.287 |
| 3188.33 | 0.288 |
| 3190.25 | 0.288 |
| 3192.18 | 0.288 |
| 3194.11 | 0.288 |
| 3196.04 | 0.288 |
| 3197.97 | 0.288 |
| 3199.9 | 0.288 |
| 3201.83 | 0.288 |
| 3203.76 | 0.289 |
| 3205.68 | 0.289 |
| 3207.61 | 0.289 |
| 3209.54 | 0.29 |
| 3211.47 | 0.29 |
| 3213.4 | 0.29 |
| 3215.33 | 0.29 |
| 3217.26 | 0.29 |
| 3219.19 | 0.29 |
| 3221.12 | 0.29 |
| 3223.04 | 0.29 |
| 3224.97 | 0.291 |
| 3226.9 | 0.291 |
| 3228.83 | 0.291 |
| 3230.76 | 0.291 |
| 3232.69 | 0.291 |
| 3234.62 | 0.291 |
| 3236.55 | 0.291 |
| 3238.47 | 0.292 |
| 3240.4 | 0.292 |
| 3242.33 | 0.292 |
| 3244.26 | 0.292 |
| 3246.19 | 0.293 |
| 3248.12 | 0.293 |
| 3250.05 | 0.293 |
| 3251.98 | 0.293 |
| 3253.9 | 0.293 |
| 3255.83 | 0.293 |
| 3257.76 | 0.293 |
| 3259.69 | 0.294 |
| 3261.62 | 0.294 |
| 3263.55 | 0.294 |
| 3265.48 | 0.294 |
| 3267.41 | 0.294 |
| 3269.34 | 0.294 |
| 3271.26 | 0.294 |
| 3273.19 | 0.295 |
| 3275.12 | 0.295 |
| 3277.05 | 0.295 |
| 3278.98 | 0.295 |
| 3280.91 | 0.295 |
| 3282.84 | 0.296 |
| 3284.77 | 0.296 |
| 3286.69 | 0.296 |
| 3288.62 | 0.296 |
| 3290.55 | 0.296 |
| 3292.48 | 0.296 |
| 3294.41 | 0.296 |
| 3296.34 | 0.296 |
| 3298.27 | 0.297 |
| 3300.2 | 0.297 |
| 3302.13 | 0.297 |
| 3304.05 | 0.297 |
| 3305.98 | 0.297 |
| 3307.91 | 0.297 |
| 3309.84 | 0.298 |
| 3311.77 | 0.298 |
| 3313.7 | 0.298 |
| 3315.63 | 0.298 |
| 3317.56 | 0.298 |
| 3319.48 | 0.299 |
| 3321.41 | 0.299 |
| 3323.34 | 0.299 |
| 3325.27 | 0.299 |
| 3327.2 | 0.299 |
| 3329.13 | 0.3 |
| 3331.06 | 0.3 |
| 3332.99 | 0.3 |
| 3334.92 | 0.3 |
| 3336.84 | 0.301 |
| 3338.77 | 0.301 |
| 3340.7 | 0.301 |
| 3342.63 | 0.302 |
| 3344.56 | 0.302 |
| 3346.49 | 0.302 |
| 3348.42 | 0.302 |
| 3350.35 | 0.302 |
| 3352.27 | 0.303 |
| 3354.2 | 0.303 |
| 3356.13 | 0.303 |
| 3358.06 | 0.304 |
| 3359.99 | 0.304 |
| 3361.92 | 0.304 |
| 3363.85 | 0.304 |
| 3365.78 | 0.304 |
| 3367.7 | 0.304 |
| 3369.63 | 0.305 |
| 3371.56 | 0.305 |
| 3373.49 | 0.305 |
| 3375.42 | 0.306 |
| 3377.35 | 0.306 |
| 3379.28 | 0.306 |
| 3381.21 | 0.306 |
| 3383.14 | 0.306 |
| 3385.06 | 0.306 |
| 3386.99 | 0.306 |
| 3388.92 | 0.307 |
| 3390.85 | 0.307 |
| 3392.78 | 0.307 |
| 3394.71 | 0.308 |
| 3396.64 | 0.308 |
| 3398.57 | 0.308 |
| 3400.49 | 0.308 |
| 3402.42 | 0.308 |
| 3404.35 | 0.308 |
| 3406.28 | 0.309 |
| 3408.21 | 0.309 |
| 3410.14 | 0.309 |
| 3412.07 | 0.309 |
| 3414.0 | 0.309 |
| 3415.93 | 0.309 |
| 3417.85 | 0.31 |
| 3419.78 | 0.31 |
| 3421.71 | 0.31 |
| 3423.64 | 0.31 |
| 3425.57 | 0.31 |
| 3427.5 | 0.31 |
| 3429.43 | 0.31 |
| 3431.36 | 0.31 |
| 3433.28 | 0.31 |
| 3435.21 | 0.31 |
| 3437.14 | 0.31 |
| 3439.07 | 0.31 |
| 3441.0 | 0.311 |
| 3442.93 | 0.311 |
| 3444.86 | 0.311 |
| 3446.79 | 0.31 |
| 3448.71 | 0.311 |
| 3450.64 | 0.311 |
| 3452.57 | 0.311 |
| 3454.5 | 0.31 |
| 3456.43 | 0.31 |
| 3458.36 | 0.31 |
| 3460.29 | 0.31 |
| 3462.22 | 0.31 |
| 3464.15 | 0.31 |
| 3466.07 | 0.31 |
| 3468.0 | 0.31 |
| 3469.93 | 0.31 |
| 3471.86 | 0.31 |
| 3473.79 | 0.31 |
| 3475.72 | 0.31 |
| 3477.65 | 0.31 |
| 3479.58 | 0.31 |
| 3481.5 | 0.31 |
| 3483.43 | 0.31 |
| 3485.36 | 0.31 |
| 3487.29 | 0.31 |
| 3489.22 | 0.31 |
| 3491.15 | 0.31 |
| 3493.08 | 0.309 |
| 3495.01 | 0.309 |
| 3496.94 | 0.309 |
| 3498.86 | 0.309 |
| 3500.79 | 0.309 |
| 3502.72 | 0.309 |
| 3504.65 | 0.309 |
| 3506.58 | 0.309 |
| 3508.51 | 0.308 |
| 3510.44 | 0.308 |
| 3512.37 | 0.308 |
| 3514.29 | 0.308 |
| 3516.22 | 0.308 |
| 3518.15 | 0.308 |
| 3520.08 | 0.308 |
| 3522.01 | 0.307 |
| 3523.94 | 0.307 |
| 3525.87 | 0.307 |
| 3527.8 | 0.307 |
| 3529.72 | 0.307 |
| 3531.65 | 0.308 |
| 3533.58 | 0.309 |
| 3535.51 | 0.309 |
| 3537.44 | 0.31 |
| 3539.37 | 0.311 |
| 3541.3 | 0.312 |
| 3543.23 | 0.312 |
| 3545.16 | 0.311 |
| 3547.08 | 0.31 |
| 3549.01 | 0.309 |
| 3550.94 | 0.308 |
| 3552.87 | 0.308 |
| 3554.8 | 0.309 |
| 3556.73 | 0.31 |
| 3558.66 | 0.311 |
| 3560.59 | 0.315 |
| 3562.51 | 0.321 |
| 3564.44 | 0.331 |
| 3566.37 | 0.345 |
| 3568.3 | 0.371 |
| 3570.23 | 0.4 |
| 3572.16 | 0.411 |
| 3574.09 | 0.393 |
| 3576.02 | 0.363 |
| 3577.95 | 0.339 |
| 3579.87 | 0.323 |
| 3581.8 | 0.314 |
| 3583.73 | 0.309 |
| 3585.66 | 0.304 |
| 3587.59 | 0.3 |
| 3589.52 | 0.3 |
| 3591.45 | 0.3 |
| 3593.38 | 0.299 |
| 3595.3 | 0.298 |
| 3597.23 | 0.298 |
| 3599.16 | 0.298 |
| 3601.09 | 0.298 |
| 3603.02 | 0.298 |
| 3604.95 | 0.298 |
| 3606.88 | 0.296 |
| 3608.81 | 0.294 |
| 3610.74 | 0.295 |
| 3612.66 | 0.294 |
| 3614.59 | 0.295 |
| 3616.52 | 0.295 |
| 3618.45 | 0.293 |
| 3620.38 | 0.293 |
| 3622.31 | 0.295 |
| 3624.24 | 0.296 |
| 3626.17 | 0.294 |
| 3628.09 | 0.29 |
| 3630.02 | 0.29 |
| 3631.95 | 0.294 |
| 3633.88 | 0.295 |
| 3635.81 | 0.295 |
| 3637.74 | 0.296 |
| 3639.67 | 0.296 |
| 3641.6 | 0.296 |
| 3643.52 | 0.296 |
| 3645.45 | 0.294 |
| 3647.38 | 0.29 |
| 3649.31 | 0.288 |
| 3651.24 | 0.29 |
| 3653.17 | 0.294 |
| 3655.1 | 0.293 |
| 3657.03 | 0.293 |
| 3658.96 | 0.295 |
| 3660.88 | 0.295 |
| 3662.81 | 0.295 |
| 3664.74 | 0.295 |
| 3666.67 | 0.294 |
| 3668.6 | 0.29 |
| 3670.53 | 0.289 |
| 3672.46 | 0.29 |
| 3674.39 | 0.288 |
| 3676.31 | 0.287 |
| 3678.24 | 0.291 |
| 3680.17 | 0.293 |
| 3682.1 | 0.294 |
| 3684.03 | 0.294 |
| 3685.96 | 0.292 |
| 3687.89 | 0.289 |
| 3689.82 | 0.288 |
| 3691.75 | 0.291 |
| 3693.67 | 0.293 |
| 3695.6 | 0.294 |
| 3697.53 | 0.294 |
| 3699.46 | 0.294 |
| 3701.39 | 0.293 |
| 3703.32 | 0.293 |
| 3705.25 | 0.294 |
| 3707.18 | 0.293 |
| 3709.1 | 0.291 |
| 3711.03 | 0.289 |
| 3712.96 | 0.291 |
| 3714.89 | 0.294 |
| 3716.82 | 0.295 |
| 3718.75 | 0.294 |
| 3720.68 | 0.293 |
| 3722.61 | 0.293 |
| 3724.53 | 0.293 |
| 3726.46 | 0.293 |
| 3728.39 | 0.294 |
| 3730.32 | 0.293 |
| 3732.25 | 0.29 |
| 3734.18 | 0.289 |
| 3736.11 | 0.289 |
| 3738.04 | 0.291 |
| 3739.97 | 0.293 |
| 3741.89 | 0.292 |
| 3743.82 | 0.287 |
| 3745.75 | 0.288 |
| 3747.68 | 0.29 |
| 3749.61 | 0.288 |
| 3751.54 | 0.288 |
| 3753.47 | 0.292 |
| 3755.4 | 0.295 |
| 3757.32 | 0.295 |
| 3759.25 | 0.294 |
| 3761.18 | 0.296 |
| 3763.11 | 0.296 |
| 3765.04 | 0.296 |
| 3766.97 | 0.295 |
| 3768.9 | 0.295 |
| 3770.83 | 0.295 |
| 3772.76 | 0.297 |
| 3774.68 | 0.298 |
| 3776.61 | 0.297 |
| 3778.54 | 0.296 |
| 3780.47 | 0.296 |
| 3782.4 | 0.297 |
| 3784.33 | 0.297 |
| 3786.26 | 0.298 |
| 3788.19 | 0.298 |
| 3790.11 | 0.298 |
| 3792.04 | 0.299 |
| 3793.97 | 0.298 |
| 3795.9 | 0.296 |
| 3797.83 | 0.296 |
| 3799.76 | 0.295 |
| 3801.69 | 0.293 |
| 3803.62 | 0.295 |
| 3805.55 | 0.296 |
| 3807.47 | 0.295 |
| 3809.4 | 0.297 |
| 3811.33 | 0.299 |
| 3813.26 | 0.297 |
| 3815.19 | 0.294 |
| 3817.12 | 0.294 |
| 3819.05 | 0.295 |
| 3820.98 | 0.293 |
| 3822.9 | 0.295 |
| 3824.83 | 0.298 |
| 3826.76 | 0.297 |
| 3828.69 | 0.298 |
| 3830.62 | 0.297 |
| 3832.55 | 0.296 |
| 3834.48 | 0.296 |
| 3836.41 | 0.294 |
| 3838.33 | 0.293 |
| 3840.26 | 0.295 |
| 3842.19 | 0.297 |
| 3844.12 | 0.297 |
| 3846.05 | 0.299 |
| 3847.98 | 0.299 |
| 3849.91 | 0.297 |
| 3851.84 | 0.292 |
| 3853.77 | 0.288 |
| 3855.69 | 0.293 |
| 3857.62 | 0.298 |
| 3859.55 | 0.299 |
| 3861.48 | 0.298 |
| 3863.41 | 0.297 |
| 3865.34 | 0.297 |
| 3867.27 | 0.297 |
| 3869.2 | 0.296 |
| 3871.12 | 0.296 |
| 3873.05 | 0.298 |
| 3874.98 | 0.299 |
| 3876.91 | 0.3 |
| 3878.84 | 0.299 |
| 3880.77 | 0.298 |
| 3882.7 | 0.299 |
| 3884.63 | 0.298 |
| 3886.56 | 0.298 |
| 3888.48 | 0.3 |
| 3890.41 | 0.299 |
| 3892.34 | 0.299 |
| 3894.27 | 0.301 |
| 3896.2 | 0.301 |
| 3898.13 | 0.299 |
| 3900.06 | 0.298 |
| 3901.99 | 0.297 |
| 3903.91 | 0.297 |
| 3905.84 | 0.299 |
| 3907.77 | 0.301 |
| 3909.7 | 0.302 |
| 3911.63 | 0.302 |
| 3913.56 | 0.302 |
| 3915.49 | 0.301 |
| 3917.42 | 0.3 |
| 3919.34 | 0.301 |
| 3921.27 | 0.301 |
| 3923.2 | 0.301 |
| 3925.13 | 0.301 |
| 3927.06 | 0.302 |
| 3928.99 | 0.302 |
| 3930.92 | 0.302 |
| 3932.85 | 0.302 |
| 3934.78 | 0.302 |
| 3936.7 | 0.303 |
| 3938.63 | 0.303 |
| 3940.56 | 0.303 |
| 3942.49 | 0.302 |
| 3944.42 | 0.302 |
| 3946.35 | 0.303 |
| 3948.28 | 0.303 |
| 3950.21 | 0.303 |
| 3952.13 | 0.303 |
| 3954.06 | 0.303 |
| 3955.99 | 0.303 |
| 3957.92 | 0.303 |
| 3959.85 | 0.303 |
| 3961.78 | 0.303 |
| 3963.71 | 0.304 |
| 3965.64 | 0.304 |
| 3967.57 | 0.304 |
| 3969.49 | 0.304 |
| 3971.42 | 0.304 |
| 3973.35 | 0.304 |
| 3975.28 | 0.304 |
| 3977.21 | 0.304 |
| 3979.14 | 0.305 |
| 3981.07 | 0.304 |
| 3983.0 | 0.304 |
| 3984.92 | 0.305 |
| 3986.85 | 0.305 |
| 3988.78 | 0.305 |
| 3990.71 | 0.305 |
| 3992.64 | 0.305 |
| 3994.57 | 0.305 |
| 3996.5 | 0.305 |
| 3998.43 | 0.305 |
| 4000.35 | 0.305 |